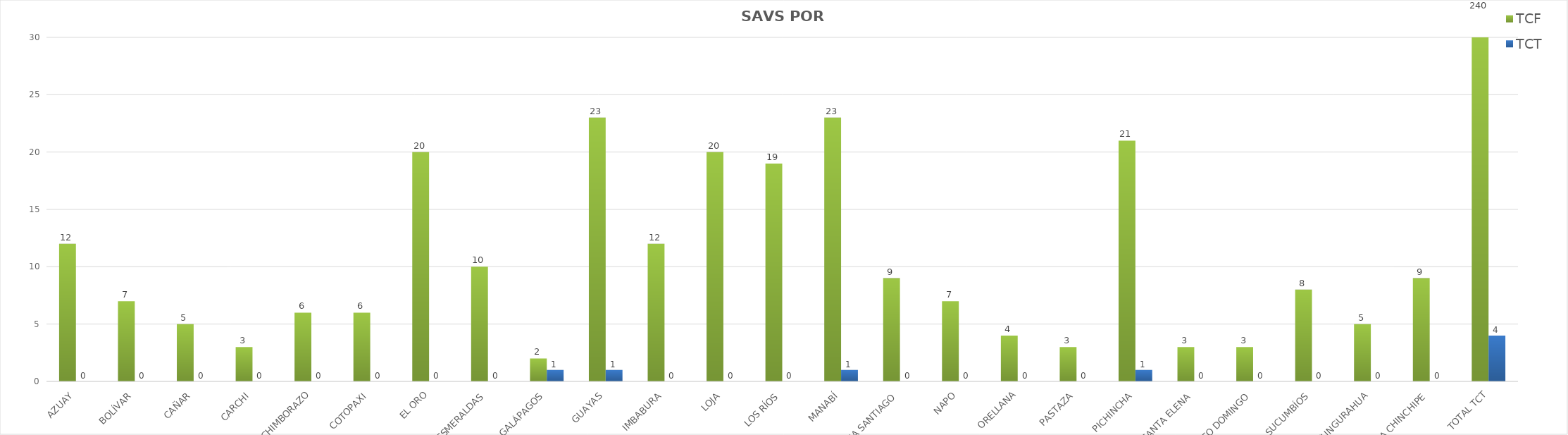
| Category | TCF | TCT |
|---|---|---|
| AZUAY | 12 | 0 |
| BOLÍVAR | 7 | 0 |
| CAÑAR | 5 | 0 |
| CARCHI | 3 | 0 |
| CHIMBORAZO | 6 | 0 |
| COTOPAXI | 6 | 0 |
| EL ORO | 20 | 0 |
| ESMERALDAS | 10 | 0 |
| GALÁPAGOS | 2 | 1 |
| GUAYAS | 23 | 1 |
| IMBABURA | 12 | 0 |
| LOJA | 20 | 0 |
| LOS RÍOS | 19 | 0 |
| MANABÍ | 23 | 1 |
| MORONA SANTIAGO | 9 | 0 |
| NAPO | 7 | 0 |
| ORELLANA | 4 | 0 |
| PASTAZA | 3 | 0 |
| PICHINCHA | 21 | 1 |
| SANTA ELENA | 3 | 0 |
| SANTO DOMINGO | 3 | 0 |
| SUCUMBÍOS | 8 | 0 |
| TUNGURAHUA | 5 | 0 |
| ZAMORA CHINCHIPE | 9 | 0 |
| TOTAL TCT | 240 | 4 |